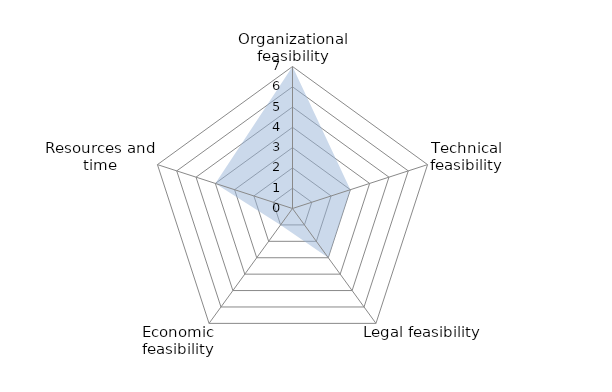
| Category | Series 0 |
|---|---|
| Organizational feasibility | 7 |
| Technical feasibility | 3 |
| Legal feasibility | 3 |
| Economic feasibility | 1 |
| Resources and time | 4 |